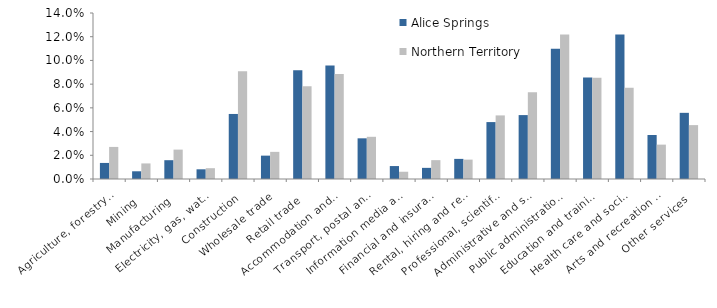
| Category | Alice Springs | Northern Territory |
|---|---|---|
| Agriculture, forestry and fishing | 0.014 | 0.027 |
| Mining | 0.007 | 0.013 |
| Manufacturing | 0.016 | 0.025 |
| Electricity, gas, water and waste services | 0.008 | 0.009 |
| Construction | 0.055 | 0.091 |
| Wholesale trade | 0.02 | 0.023 |
| Retail trade | 0.092 | 0.078 |
| Accommodation and food services | 0.096 | 0.089 |
| Transport, postal and warehousing | 0.034 | 0.036 |
| Information media and telecommunications | 0.011 | 0.006 |
| Financial and insurance services | 0.009 | 0.016 |
| Rental, hiring and real estate services | 0.017 | 0.016 |
| Professional, scientific and technical services | 0.048 | 0.054 |
| Administrative and support services | 0.054 | 0.073 |
| Public administration and safety | 0.11 | 0.122 |
| Education and training | 0.086 | 0.085 |
| Health care and social assistance | 0.122 | 0.077 |
| Arts and recreation services | 0.037 | 0.029 |
| Other services | 0.056 | 0.045 |